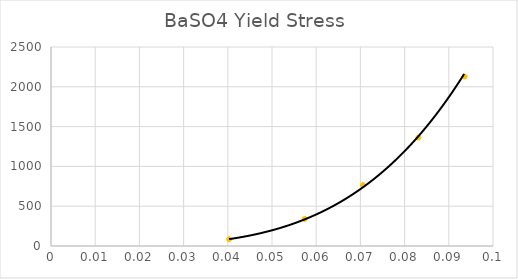
| Category | BaSO4  |
|---|---|
| 0.040302677598861615 | 84.71 |
| 0.05737897633633481 | 339.767 |
| 0.07059652130245689 | 765.393 |
| 0.08312170779582753 | 1361.736 |
| 0.09359356482956442 | 2128.755 |